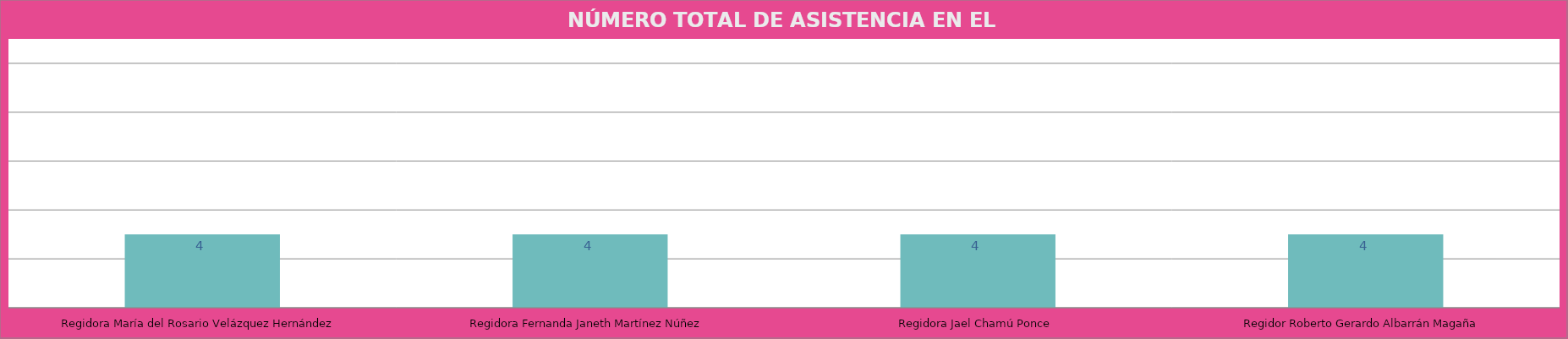
| Category | Regidora María del Rosario Velázquez Hernández Regidora Fernanda Janeth Martínez Núñez Regidora Jael Chamú Ponce Regidor Roberto Gerardo Albarrán Magaña |
|---|---|
| Regidora María del Rosario Velázquez Hernández | 4 |
| Regidora Fernanda Janeth Martínez Núñez | 4 |
| Regidora Jael Chamú Ponce | 4 |
| Regidor Roberto Gerardo Albarrán Magaña | 4 |